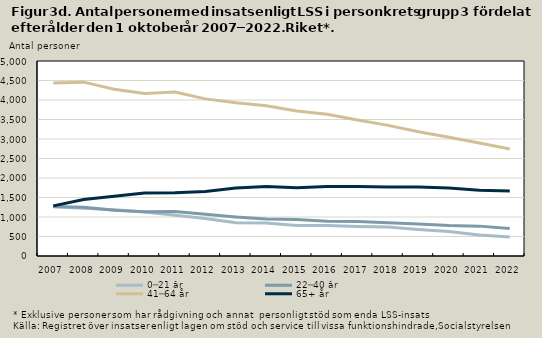
| Category | 0─21 år | 22─40 år | 41─64 år | 65+ år |
|---|---|---|---|---|
| 2007.0 | 1261 | 1272 | 4434 | 1285 |
| 2008.0 | 1225 | 1251 | 4458 | 1448 |
| 2009.0 | 1186 | 1171 | 4278 | 1532 |
| 2010.0 | 1130 | 1137 | 4166 | 1615 |
| 2011.0 | 1044 | 1140 | 4204 | 1624 |
| 2012.0 | 963 | 1068 | 4029 | 1655 |
| 2013.0 | 855 | 1001 | 3927 | 1746 |
| 2014.0 | 846 | 946 | 3851 | 1784 |
| 2015.0 | 780 | 934 | 3720 | 1751 |
| 2016.0 | 780 | 888 | 3636 | 1784 |
| 2017.0 | 759 | 886 | 3486 | 1785 |
| 2018.0 | 741 | 855 | 3349 | 1772 |
| 2019.0 | 681 | 818 | 3185 | 1768 |
| 2020.0 | 631 | 783 | 3044 | 1744 |
| 2021.0 | 536 | 766 | 2895 | 1685 |
| 2022.0 | 485 | 703 | 2742 | 1668 |